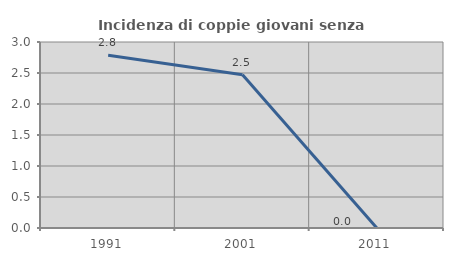
| Category | Incidenza di coppie giovani senza figli |
|---|---|
| 1991.0 | 2.786 |
| 2001.0 | 2.473 |
| 2011.0 | 0 |